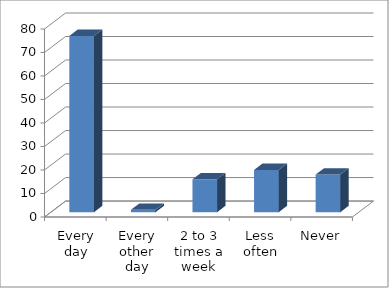
| Category | Series 0 |
|---|---|
| Every day | 75 |
| Every other day | 1 |
| 2 to 3 times a week | 14 |
| Less often | 18 |
| Never | 16 |